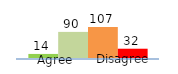
| Category | Series 0 | Series 1 | Series 2 | Series 3 |
|---|---|---|---|---|
| 0 | 14 | 90 | 107 | 32 |